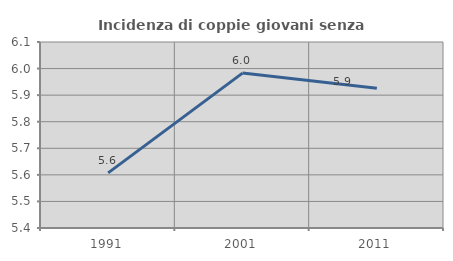
| Category | Incidenza di coppie giovani senza figli |
|---|---|
| 1991.0 | 5.607 |
| 2001.0 | 5.983 |
| 2011.0 | 5.926 |